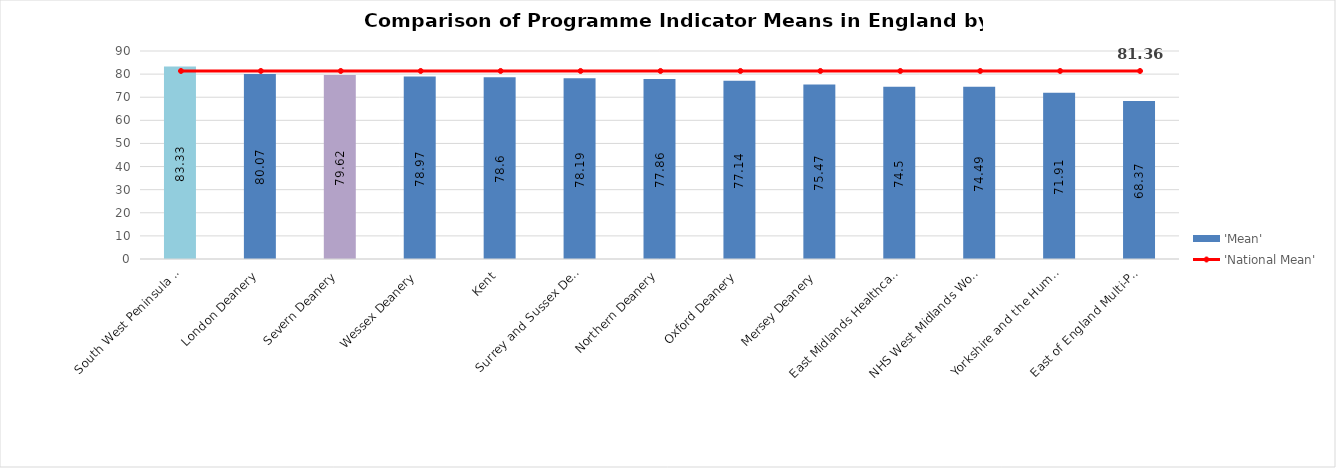
| Category | 'Mean' |
|---|---|
| South West Peninsula Deanery | 83.33 |
| London Deanery | 80.07 |
| Severn Deanery | 79.62 |
| Wessex Deanery | 78.97 |
| Kent, Surrey and Sussex Deanery | 78.6 |
| Northern Deanery | 78.19 |
| Oxford Deanery | 77.86 |
| Mersey Deanery | 77.14 |
| East Midlands Healthcare Workforce Deanery | 75.47 |
| NHS West Midlands Workforce Deanery | 74.5 |
| Yorkshire and the Humber Postgraduate Deanery | 74.49 |
| East of England Multi-Professional Deanery | 71.91 |
| North Western Deanery | 68.37 |